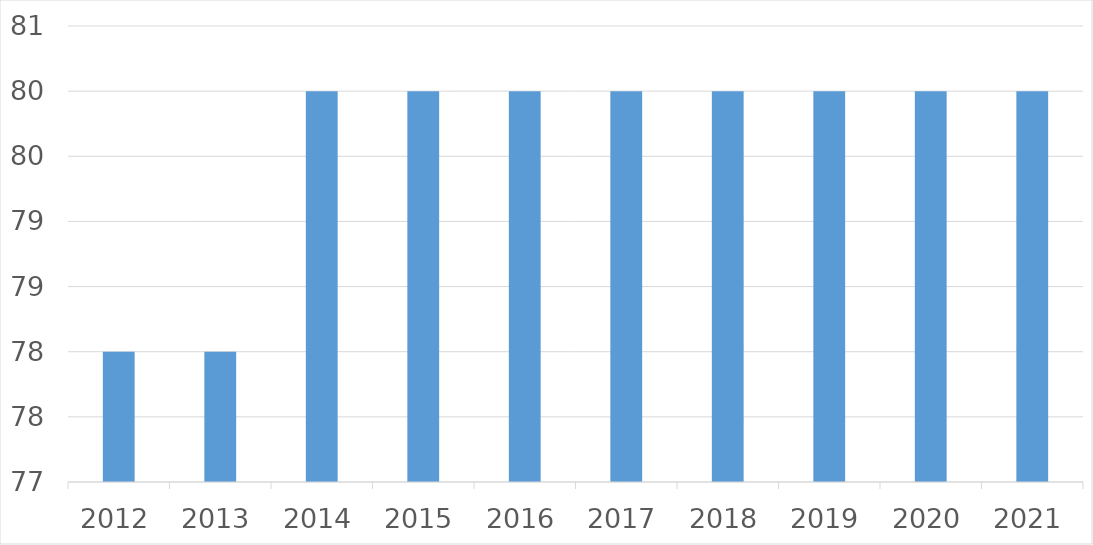
| Category | Series 0 |
|---|---|
| 2012 | 78 |
| 2013 | 78 |
| 2014 | 80 |
| 2015 | 80 |
| 2016 | 80 |
| 2017 | 80 |
| 2018 | 80 |
| 2019 | 80 |
| 2020 | 80 |
| 2021 | 80 |